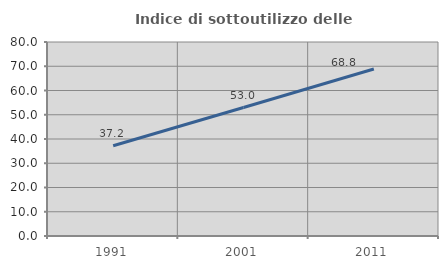
| Category | Indice di sottoutilizzo delle abitazioni  |
|---|---|
| 1991.0 | 37.209 |
| 2001.0 | 52.985 |
| 2011.0 | 68.841 |